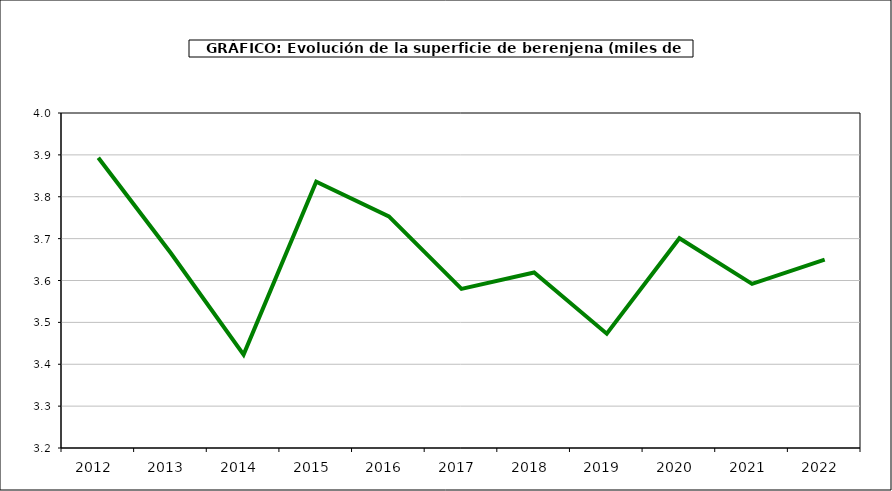
| Category | superficie |
|---|---|
| 2012.0 | 3.893 |
| 2013.0 | 3.665 |
| 2014.0 | 3.423 |
| 2015.0 | 3.836 |
| 2016.0 | 3.753 |
| 2017.0 | 3.58 |
| 2018.0 | 3.619 |
| 2019.0 | 3.473 |
| 2020.0 | 3.701 |
| 2021.0 | 3.592 |
| 2022.0 | 3.65 |